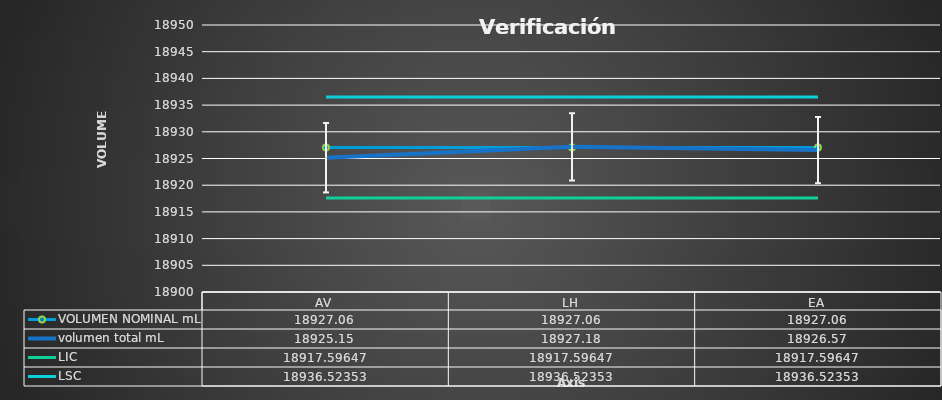
| Category | VOLUMEN NOMINAL mL | volumen total mL | LIC | LSC |
|---|---|---|---|---|
| 0 | 18927.06 | 18925.15 | 18917.596 | 18936.524 |
| 1 | 18927.06 | 18927.18 | 18917.596 | 18936.524 |
| 2 | 18927.06 | 18926.57 | 18917.596 | 18936.524 |